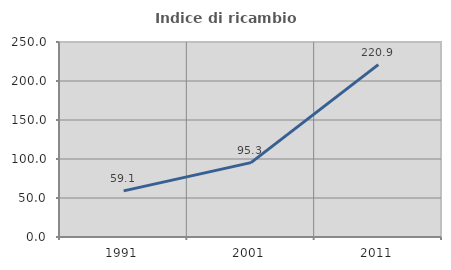
| Category | Indice di ricambio occupazionale  |
|---|---|
| 1991.0 | 59.135 |
| 2001.0 | 95.333 |
| 2011.0 | 220.93 |